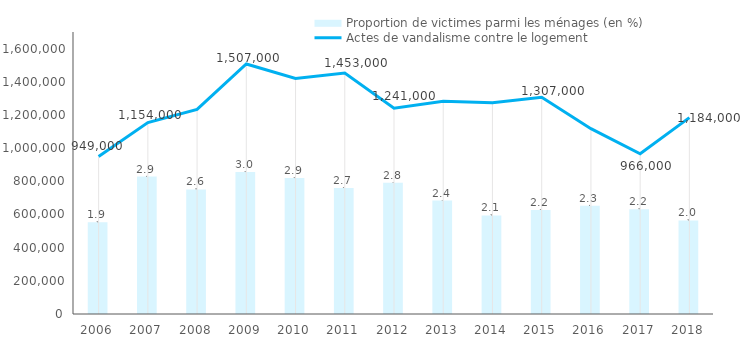
| Category | Proportion de victimes parmi les ménages (en %) |
|---|---|
| 2006.0 | 1.95 |
| 2007.0 | 2.923 |
| 2008.0 | 2.65 |
| 2009.0 | 3.02 |
| 2010.0 | 2.892 |
| 2011.0 | 2.683 |
| 2012.0 | 2.795 |
| 2013.0 | 2.414 |
| 2014.0 | 2.096 |
| 2015.0 | 2.215 |
| 2016.0 | 2.303 |
| 2017.0 | 2.228 |
| 2018.0 | 1.99 |